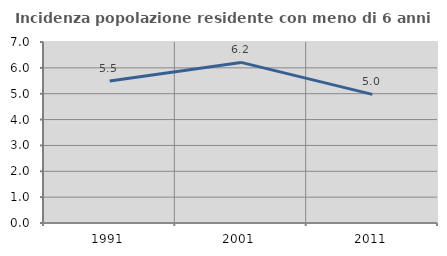
| Category | Incidenza popolazione residente con meno di 6 anni |
|---|---|
| 1991.0 | 5.493 |
| 2001.0 | 6.211 |
| 2011.0 | 4.975 |